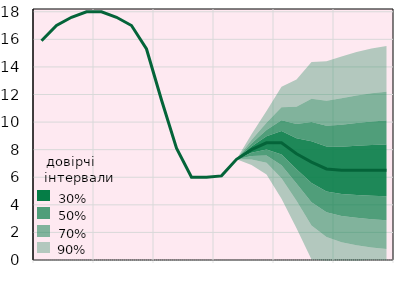
| Category | Облікова ставка, % |
|---|---|
|  | 15.9 |
|  | 17 |
|  | 17.6 |
| IV.18 | 18 |
|  | 18 |
|  | 17.6 |
|  | 17 |
| IV.19 | 15.3 |
|  | 11.6 |
|  | 8.1 |
|  | 6 |
| IV.20 | 6 |
|  | 6.1 |
|  | 7.3 |
|  | 8 |
| IV.21 | 8.5 |
|  | 8.5 |
|  | 7.7 |
|  | 7.1 |
| IV.22 | 6.6 |
|  | 6.5 |
|  | 6.5 |
|  | 6.5 |
| IV.23 | 6.5 |